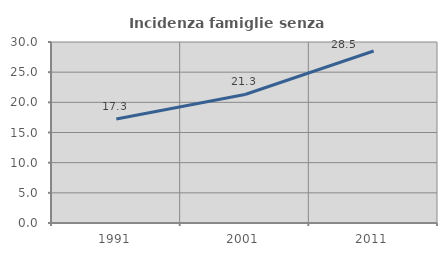
| Category | Incidenza famiglie senza nuclei |
|---|---|
| 1991.0 | 17.252 |
| 2001.0 | 21.3 |
| 2011.0 | 28.505 |